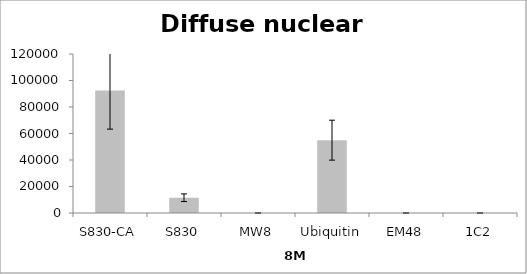
| Category | Series 0 |
|---|---|
| S830-CA | 92378.193 |
| S830 | 11517.976 |
| MW8 | 0 |
| Ubiquitin | 54969.453 |
| EM48 | 0 |
| 1C2 | 0 |